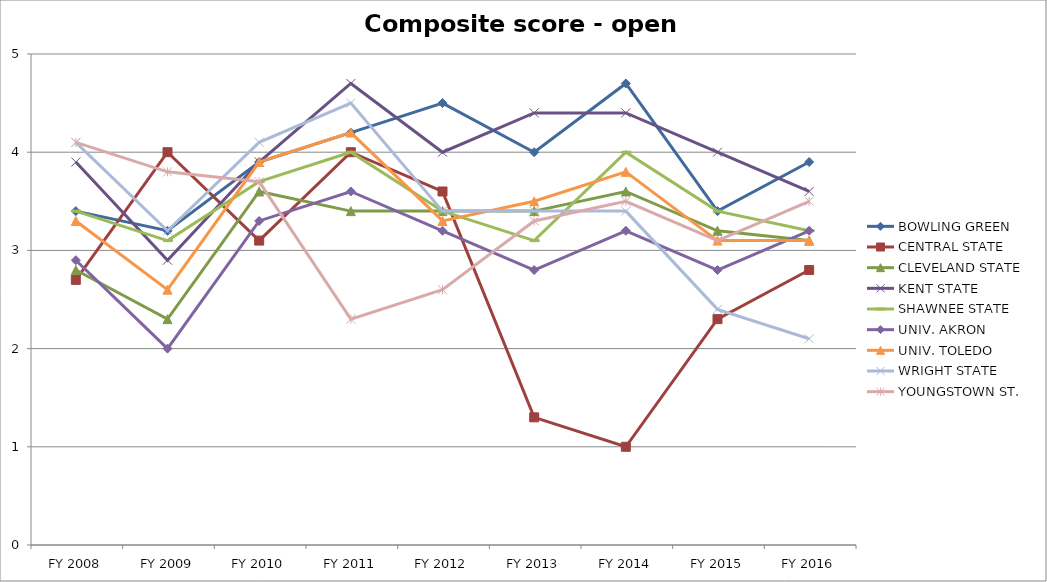
| Category | BOWLING GREEN  | CENTRAL STATE  | CLEVELAND STATE  | KENT STATE  | SHAWNEE STATE  | UNIV. AKRON  | UNIV. TOLEDO  | WRIGHT STATE  | YOUNGSTOWN ST.  |
|---|---|---|---|---|---|---|---|---|---|
| FY 2016 | 3.9 | 2.8 | 3.1 | 3.6 | 3.2 | 3.2 | 3.1 | 2.1 | 3.5 |
| FY 2015 | 3.4 | 2.3 | 3.2 | 4 | 3.4 | 2.8 | 3.1 | 2.4 | 3.1 |
| FY 2014 | 4.7 | 1 | 3.6 | 4.4 | 4 | 3.2 | 3.8 | 3.4 | 3.5 |
| FY 2013 | 4 | 1.3 | 3.4 | 4.4 | 3.1 | 2.8 | 3.5 | 3.4 | 3.3 |
| FY 2012 | 4.5 | 3.6 | 3.4 | 4 | 3.4 | 3.2 | 3.3 | 3.4 | 2.6 |
| FY 2011 | 4.2 | 4 | 3.4 | 4.7 | 4 | 3.6 | 4.2 | 4.5 | 2.3 |
| FY 2010 | 3.9 | 3.1 | 3.6 | 3.9 | 3.7 | 3.3 | 3.9 | 4.1 | 3.7 |
| FY 2009 | 3.2 | 4 | 2.3 | 2.9 | 3.1 | 2 | 2.6 | 3.2 | 3.8 |
| FY 2008 | 3.4 | 2.7 | 2.8 | 3.9 | 3.4 | 2.9 | 3.3 | 4.1 | 4.1 |